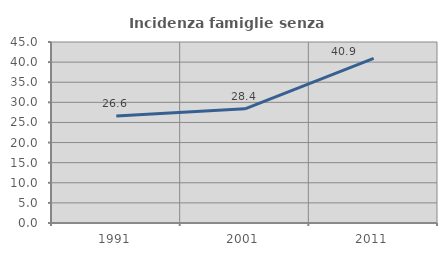
| Category | Incidenza famiglie senza nuclei |
|---|---|
| 1991.0 | 26.619 |
| 2001.0 | 28.387 |
| 2011.0 | 40.936 |